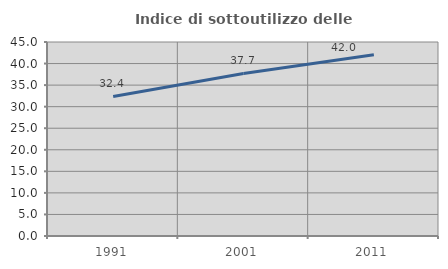
| Category | Indice di sottoutilizzo delle abitazioni  |
|---|---|
| 1991.0 | 32.378 |
| 2001.0 | 37.704 |
| 2011.0 | 42.027 |